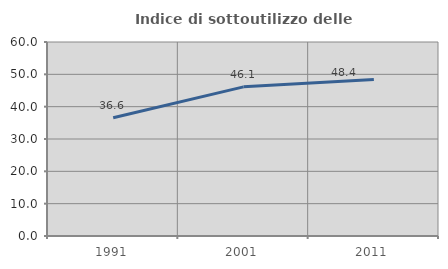
| Category | Indice di sottoutilizzo delle abitazioni  |
|---|---|
| 1991.0 | 36.576 |
| 2001.0 | 46.124 |
| 2011.0 | 48.415 |